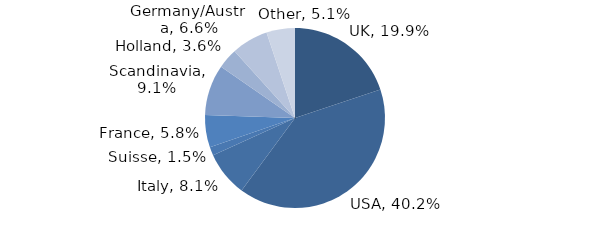
| Category | Investment Style |
|---|---|
| UK | 0.199 |
| USA | 0.402 |
| Italy | 0.081 |
| Suisse | 0.015 |
| France | 0.058 |
| Scandinavia | 0.091 |
| Holland | 0.036 |
| Germany/Austria | 0.066 |
| Other | 0.051 |